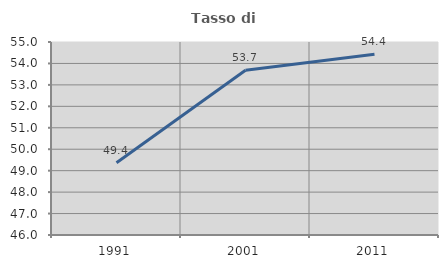
| Category | Tasso di occupazione   |
|---|---|
| 1991.0 | 49.367 |
| 2001.0 | 53.679 |
| 2011.0 | 54.433 |